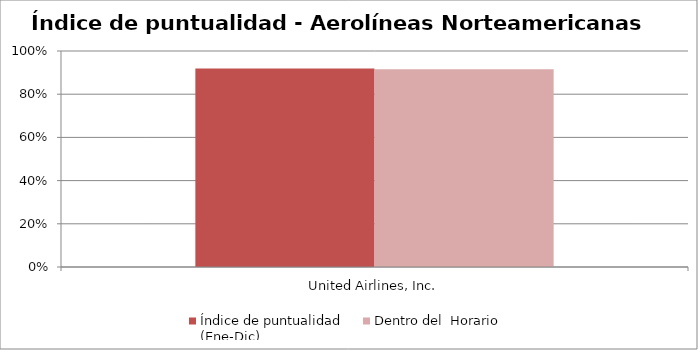
| Category | Índice de puntualidad
(Ene-Dic) | Dentro del  Horario |
|---|---|---|
| United Airlines, Inc. | 0.919 | 0.915 |